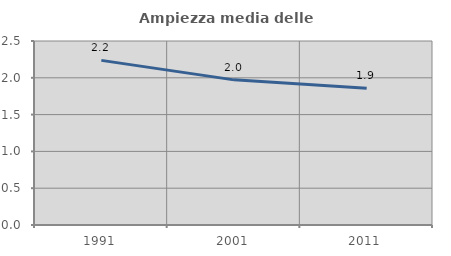
| Category | Ampiezza media delle famiglie |
|---|---|
| 1991.0 | 2.237 |
| 2001.0 | 1.972 |
| 2011.0 | 1.856 |